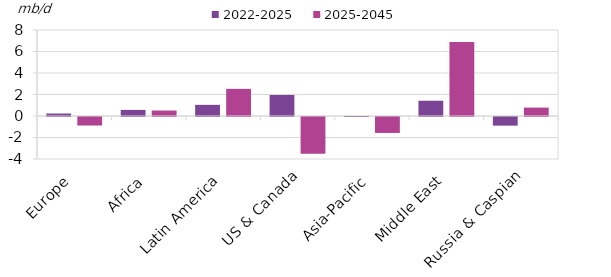
| Category | 2022-2025 | 2025-2045 |
|---|---|---|
| Europe | 0.23 | -0.792 |
| Africa | 0.568 | 0.51 |
| Latin America | 1.038 | 2.525 |
| US & Canada | 1.951 | -3.416 |
| Asia-Pacific | 0.002 | -1.485 |
| Middle East | 1.42 | 6.89 |
| Russia & Caspian | -0.804 | 0.782 |